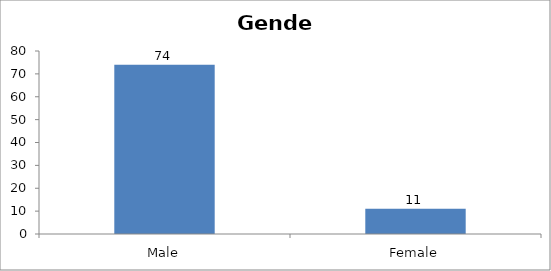
| Category | Gender |
|---|---|
| Male | 74 |
| Female | 11 |